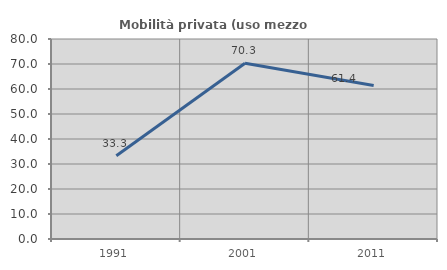
| Category | Mobilità privata (uso mezzo privato) |
|---|---|
| 1991.0 | 33.333 |
| 2001.0 | 70.27 |
| 2011.0 | 61.364 |